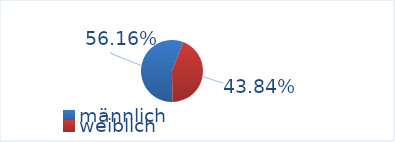
| Category | Series 0 |
|---|---|
| männlich | 56.164 |
| weiblich | 43.836 |